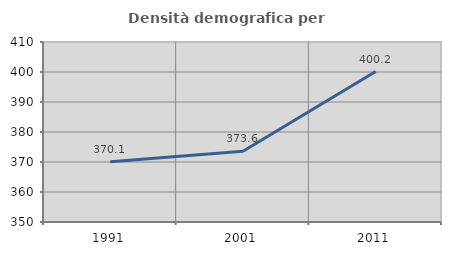
| Category | Densità demografica |
|---|---|
| 1991.0 | 370.114 |
| 2001.0 | 373.573 |
| 2011.0 | 400.164 |